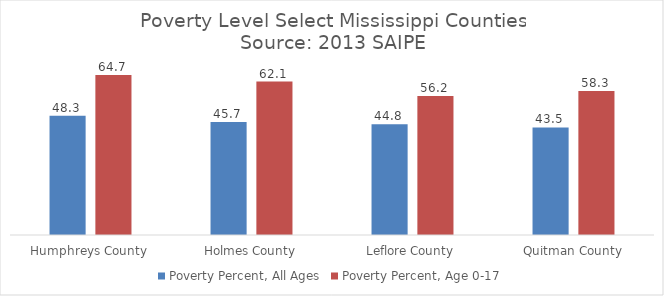
| Category | Poverty Percent, All Ages | Poverty Percent, Age 0-17 |
|---|---|---|
| Humphreys County | 48.3 | 64.7 |
| Holmes County | 45.7 | 62.1 |
| Leflore County | 44.8 | 56.2 |
| Quitman County | 43.5 | 58.3 |